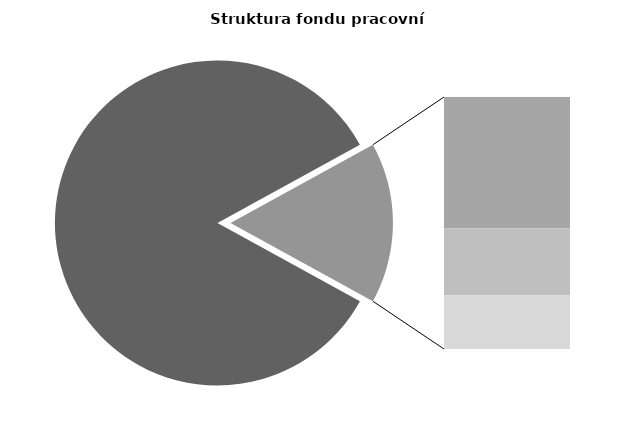
| Category | Series 0 |
|---|---|
| Průměrná měsíční odpracovaná doba bez přesčasu | 142.107 |
| Dovolená | 14.086 |
| Nemoc | 7.209 |
| Jiné | 5.766 |